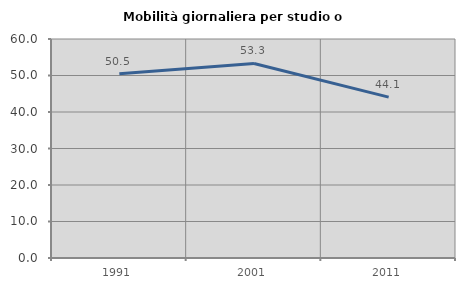
| Category | Mobilità giornaliera per studio o lavoro |
|---|---|
| 1991.0 | 50.512 |
| 2001.0 | 53.309 |
| 2011.0 | 44.068 |